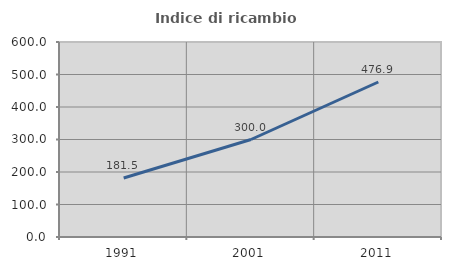
| Category | Indice di ricambio occupazionale  |
|---|---|
| 1991.0 | 181.481 |
| 2001.0 | 300 |
| 2011.0 | 476.923 |